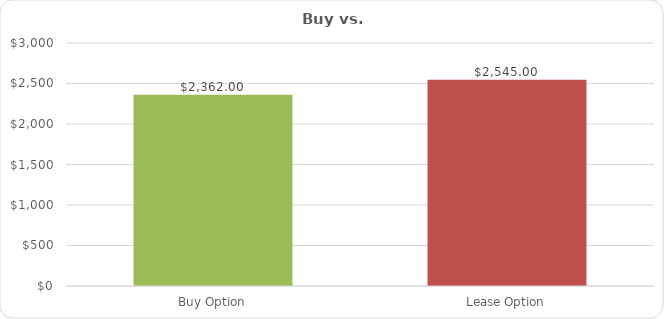
| Category | Series 0 |
|---|---|
| Buy Option | 2362 |
| Lease Option | 2545 |